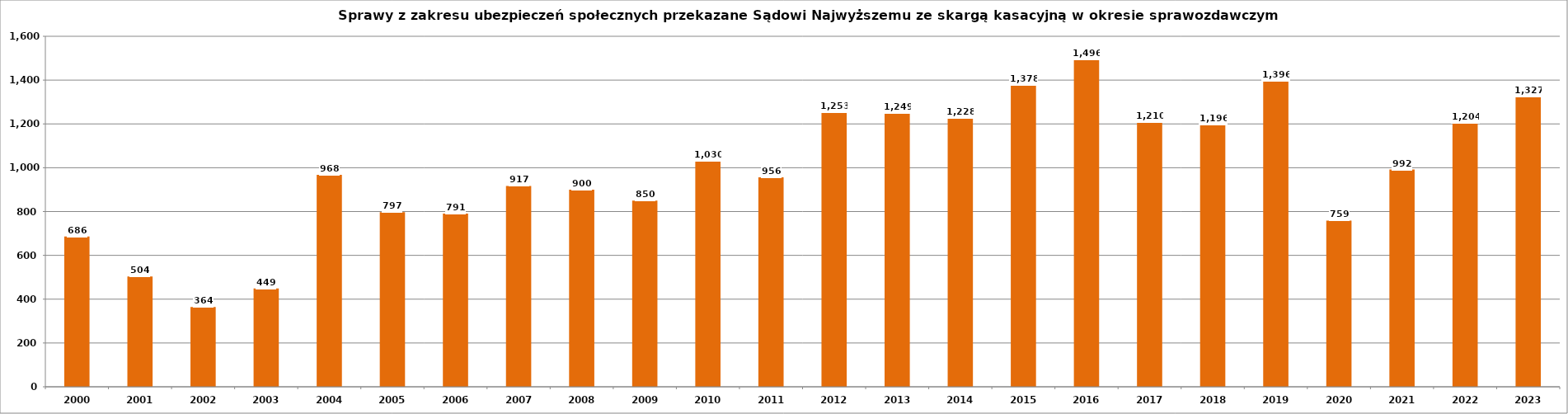
| Category | Series 0 |
|---|---|
| 2000.0 | 686 |
| 2001.0 | 504 |
| 2002.0 | 364 |
| 2003.0 | 449 |
| 2004.0 | 968 |
| 2005.0 | 797 |
| 2006.0 | 791 |
| 2007.0 | 917 |
| 2008.0 | 900 |
| 2009.0 | 850 |
| 2010.0 | 1030 |
| 2011.0 | 956 |
| 2012.0 | 1253 |
| 2013.0 | 1249 |
| 2014.0 | 1228 |
| 2015.0 | 1378 |
| 2016.0 | 1496 |
| 2017.0 | 1210 |
| 2018.0 | 1196 |
| 2019.0 | 1396 |
| 2020.0 | 759 |
| 2021.0 | 992 |
| 2022.0 | 1204 |
| 2023.0 | 1327 |